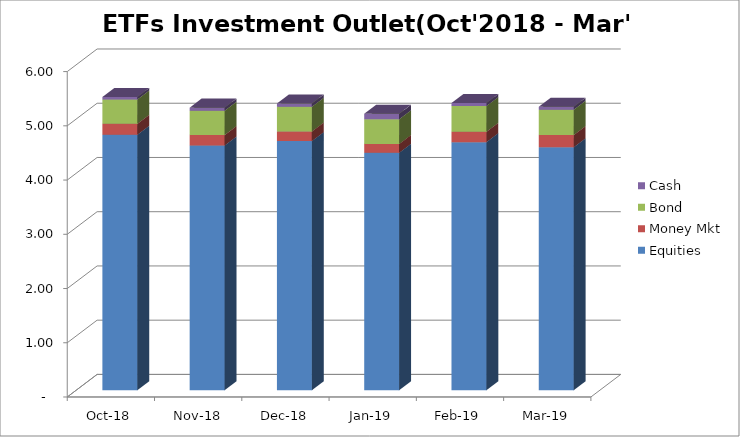
| Category | Equities | Money Mkt | Bond | Cash |
|---|---|---|---|---|
| 2018-10-01 | 4710183549.74 | 201812628.7 | 448435810.88 | 45392103.41 |
| 2018-11-01 | 4511471490.81 | 192561506.44 | 449623716.37 | 56722794.06 |
| 2018-12-01 | 4593226725.97 | 177224498.42 | 455822889.82 | 58868504.36 |
| 2019-01-01 | 4377264283.99 | 163856975.18 | 454756838.17 | 99509145.72 |
| 2019-02-01 | 4574101498.89 | 190249365.75 | 475081203.96 | 56714065.08 |
| 2019-03-01 | 4479173842.33 | 225580048.82 | 467336909.16 | 53276506 |